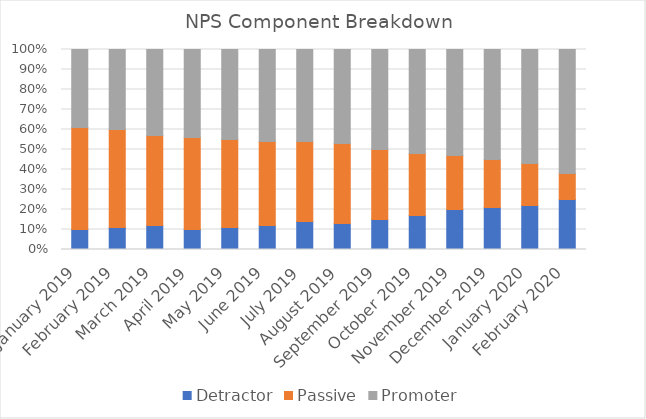
| Category | Detractor | Passive | Promoter |
|---|---|---|---|
| January 2019 | 0.1 | 0.51 | 0.39 |
| February 2019 | 0.11 | 0.49 | 0.4 |
| March 2019 | 0.12 | 0.45 | 0.43 |
| April 2019 | 0.1 | 0.46 | 0.44 |
| May 2019 | 0.11 | 0.44 | 0.45 |
| June 2019 | 0.12 | 0.42 | 0.46 |
| July 2019 | 0.14 | 0.4 | 0.46 |
| August 2019 | 0.13 | 0.4 | 0.47 |
| September 2019 | 0.15 | 0.35 | 0.5 |
| October 2019 | 0.17 | 0.31 | 0.52 |
| November 2019 | 0.2 | 0.27 | 0.53 |
| December 2019 | 0.21 | 0.24 | 0.55 |
| January 2020 | 0.22 | 0.21 | 0.57 |
| February 2020 | 0.25 | 0.13 | 0.62 |